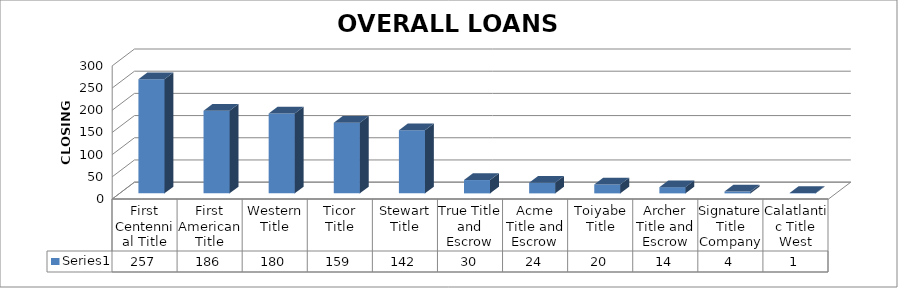
| Category | Series 0 |
|---|---|
| First Centennial Title | 257 |
| First American Title | 186 |
| Western Title | 180 |
| Ticor Title | 159 |
| Stewart Title | 142 |
| True Title and Escrow | 30 |
| Acme Title and Escrow | 24 |
| Toiyabe Title | 20 |
| Archer Title and Escrow | 14 |
| Signature Title Company | 4 |
| Calatlantic Title West | 1 |